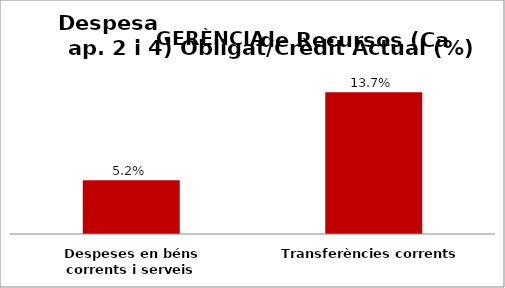
| Category | Series 0 |
|---|---|
| Despeses en béns corrents i serveis | 0.052 |
| Transferències corrents | 0.137 |